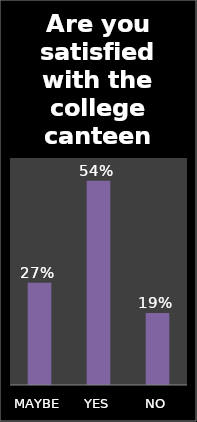
| Category | Series 0 |
|---|---|
| MAYBE | 0.27 |
| YES | 0.54 |
| NO | 0.19 |